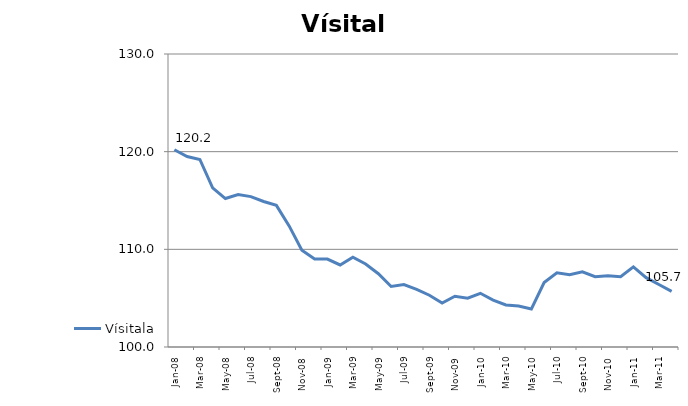
| Category | Vísitala |
|---|---|
| 2008-01-01 | 120.2 |
| 2008-02-01 | 119.5 |
| 2008-03-01 | 119.2 |
| 2008-04-01 | 116.3 |
| 2008-05-01 | 115.2 |
| 2008-06-01 | 115.6 |
| 2008-07-01 | 115.4 |
| 2008-08-01 | 114.9 |
| 2008-09-01 | 114.5 |
| 2008-10-01 | 112.4 |
| 2008-11-01 | 109.9 |
| 2008-12-01 | 109 |
| 2009-01-01 | 109 |
| 2009-02-01 | 108.4 |
| 2009-03-01 | 109.2 |
| 2009-04-01 | 108.5 |
| 2009-05-01 | 107.5 |
| 2009-06-01 | 106.2 |
| 2009-07-01 | 106.4 |
| 2009-08-01 | 105.9 |
| 2009-09-01 | 105.3 |
| 2009-10-01 | 104.5 |
| 2009-11-01 | 105.2 |
| 2009-12-01 | 105 |
| 2010-01-01 | 105.5 |
| 2010-02-01 | 104.8 |
| 2010-03-01 | 104.3 |
| 2010-04-01 | 104.2 |
| 2010-05-01 | 103.9 |
| 2010-06-01 | 106.6 |
| 2010-07-01 | 107.6 |
| 2010-08-01 | 107.4 |
| 2010-09-01 | 107.7 |
| 2010-10-01 | 107.2 |
| 2010-11-01 | 107.3 |
| 2010-12-01 | 107.2 |
| 2011-01-01 | 108.2 |
| 2011-02-01 | 107.1 |
| 2011-03-01 | 106.4 |
| 2011-04-01 | 105.7 |